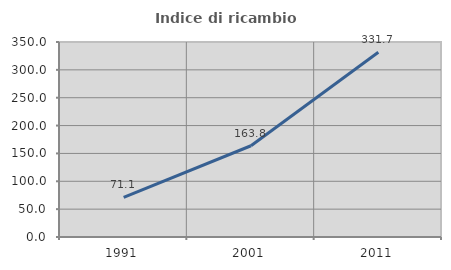
| Category | Indice di ricambio occupazionale  |
|---|---|
| 1991.0 | 71.053 |
| 2001.0 | 163.793 |
| 2011.0 | 331.707 |